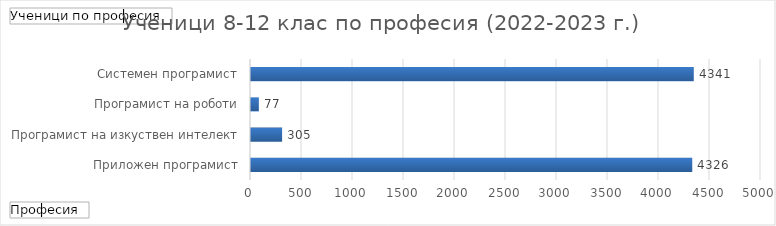
| Category | Total |
|---|---|
| Приложен програмист | 4326 |
| Програмист на изкуствен интелект | 305 |
| Програмист на роботи | 77 |
| Системен програмист | 4341 |